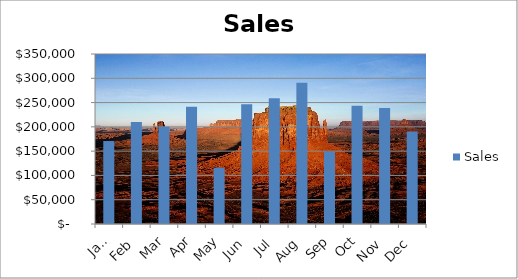
| Category | Sales |
|---|---|
| Jan. | 170819 |
| Feb | 210000 |
| Mar | 200000 |
| Apr | 241558 |
| May | 115936 |
| Jun | 246689 |
| Jul | 258990 |
| Aug | 290930 |
| Sep | 149112 |
| Oct | 243629 |
| Nov | 239075 |
| Dec | 190453 |